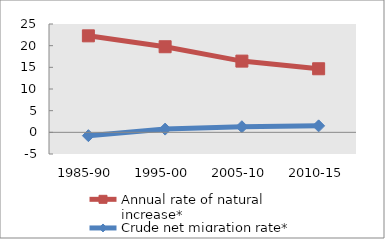
| Category | Annual rate of natural increase* | Crude net migration rate* |
|---|---|---|
| 1985-90 | 22.27 | -0.769 |
| 1995-00 | 19.751 | 0.745 |
| 2005-10 | 16.436 | 1.292 |
| 2010-15 | 14.67 | 1.491 |